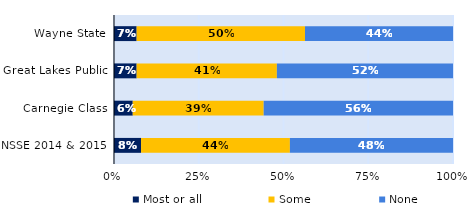
| Category | Most or all | Some | None |
|---|---|---|---|
| Wayne State | 0.067 | 0.497 | 0.437 |
| Great Lakes Public | 0.067 | 0.414 | 0.52 |
| Carnegie Class | 0.055 | 0.386 | 0.558 |
| NSSE 2014 & 2015 | 0.08 | 0.439 | 0.481 |